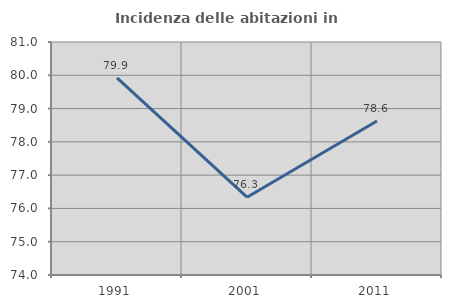
| Category | Incidenza delle abitazioni in proprietà  |
|---|---|
| 1991.0 | 79.925 |
| 2001.0 | 76.338 |
| 2011.0 | 78.627 |